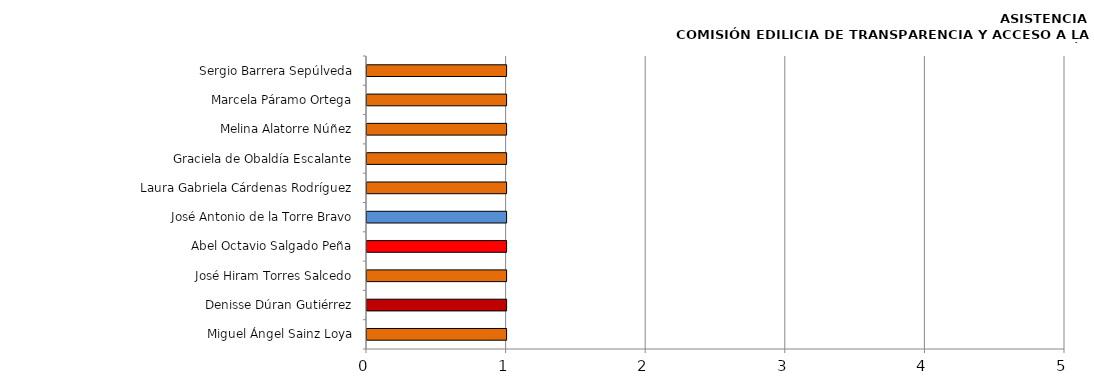
| Category | Series 0 |
|---|---|
| Miguel Ángel Sainz Loya | 1 |
| Denisse Dúran Gutiérrez | 1 |
| José Hiram Torres Salcedo | 1 |
| Abel Octavio Salgado Peña | 1 |
| José Antonio de la Torre Bravo | 1 |
| Laura Gabriela Cárdenas Rodríguez | 1 |
| Graciela de Obaldía Escalante | 1 |
| Melina Alatorre Núñez | 1 |
| Marcela Páramo Ortega | 1 |
| Sergio Barrera Sepúlveda | 1 |